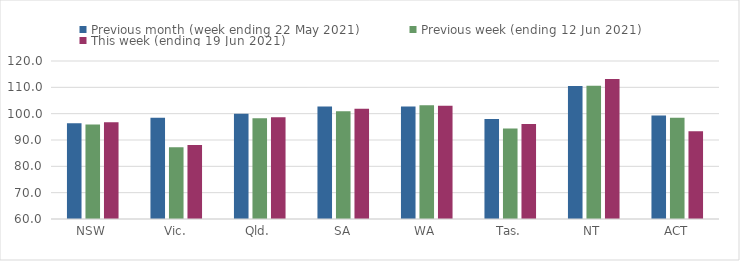
| Category | Previous month (week ending 22 May 2021) | Previous week (ending 12 Jun 2021) | This week (ending 19 Jun 2021) |
|---|---|---|---|
| NSW | 96.37 | 95.93 | 96.7 |
| Vic. | 98.43 | 87.21 | 88.13 |
| Qld. | 99.99 | 98.28 | 98.66 |
| SA | 102.76 | 100.88 | 101.91 |
| WA | 102.73 | 103.23 | 103.02 |
| Tas. | 98 | 94.35 | 96.1 |
| NT | 110.47 | 110.58 | 113.13 |
| ACT | 99.35 | 98.44 | 93.3 |